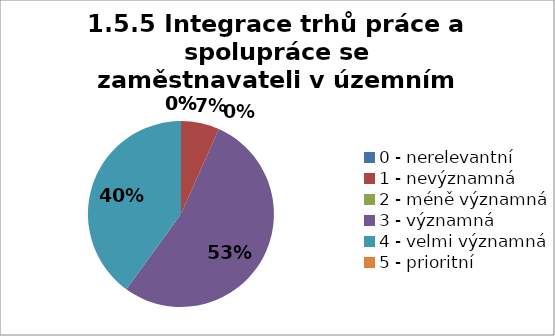
| Category | Series 2 | Series 1 | Series 0 |
|---|---|---|---|
| 0 - nerelevantní | 0 | 0 | 0 |
| 1 - nevýznamná | 6.667 | 0 | 0 |
| 2 - méně významná | 0 | 6.667 | 0 |
| 3 - významná | 53.333 | 46.667 | 33.333 |
| 4 - velmi významná | 40 | 33.333 | 40 |
| 5 - prioritní | 0 | 13.333 | 26.667 |